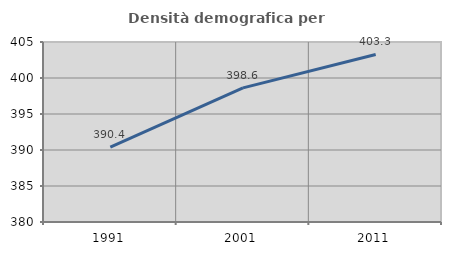
| Category | Densità demografica |
|---|---|
| 1991.0 | 390.396 |
| 2001.0 | 398.628 |
| 2011.0 | 403.271 |